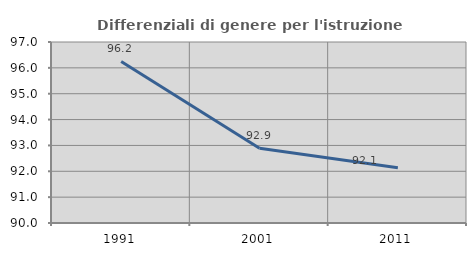
| Category | Differenziali di genere per l'istruzione superiore |
|---|---|
| 1991.0 | 96.248 |
| 2001.0 | 92.894 |
| 2011.0 | 92.137 |